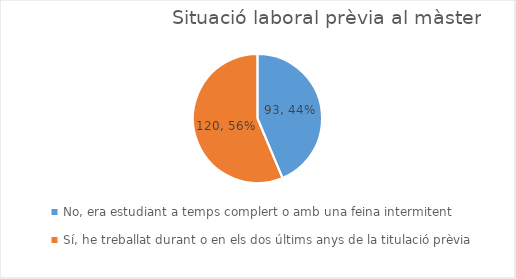
| Category | Series 0 |
|---|---|
| No, era estudiant a temps complert o amb una feina intermitent
 | 93 |
| Sí, he treballat durant o en els dos últims anys de la titulació prèvia | 120 |